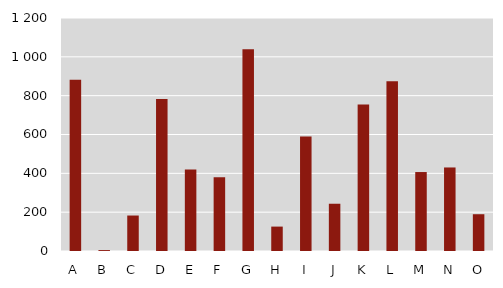
| Category | Series 0 |
|---|---|
| A | 882.6 |
| B | 4.7 |
| C | 182.7 |
| D | 783.1 |
| E | 419.1 |
| F | 379.9 |
| G | 1039.3 |
| H | 125.7 |
| I | 589.8 |
| J | 243.4 |
| K | 754.8 |
| L | 873.9 |
| M | 406.7 |
| N | 430.2 |
| O | 189.4 |